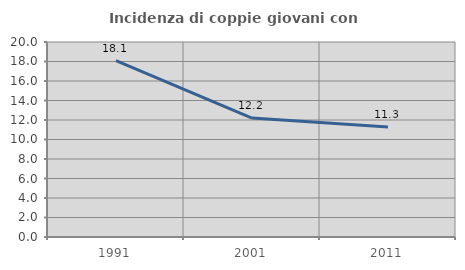
| Category | Incidenza di coppie giovani con figli |
|---|---|
| 1991.0 | 18.084 |
| 2001.0 | 12.195 |
| 2011.0 | 11.275 |